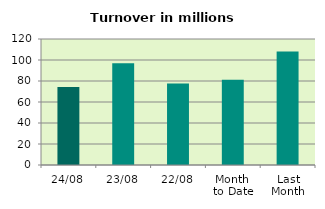
| Category | Series 0 |
|---|---|
| 24/08 | 74.169 |
| 23/08 | 96.792 |
| 22/08 | 77.722 |
| Month 
to Date | 81.267 |
| Last
Month | 108.022 |